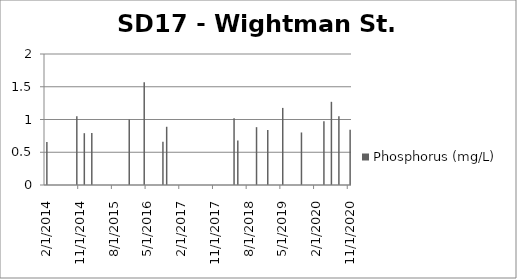
| Category | Phosphorus (mg/L) |
|---|---|
| 2/12/14 | 0.657 |
| 10/8/14 | 1.05 |
| 12/11/14 | 0.791 |
| 2/2/15 | 0.794 |
| 12/10/15 | 1 |
| 4/14/16 | 1.57 |
| 9/7/16 | 0.661 |
| 10/14/16 | 0.889 |
| 4/12/18 | 1.02 |
| 5/16/18 | 0.68 |
| 10/24/18 | 0.883 |
| 1/17/19 | 0.84 |
| 5/16/19 | 1.177 |
| 10/17/19 | 0.802 |
| 4/22/20 | 0.972 |
| 6/23/20 | 1.27 |
| 8/20/20 | 1.048 |
| 11/18/20 | 0.845 |